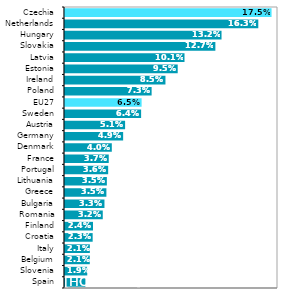
| Category | 2020 |
|---|---|
| Spain | 0.017 |
| Slovenia | 0.019 |
| Belgium | 0.021 |
| Italy | 0.021 |
| Croatia | 0.023 |
| Finland | 0.024 |
| Romania | 0.032 |
| Bulgaria | 0.033 |
| Greece | 0.035 |
| Lithuania | 0.035 |
| Portugal | 0.036 |
| France | 0.037 |
| Denmark | 0.04 |
| Germany | 0.049 |
| Austria | 0.051 |
| Sweden | 0.064 |
| EU27 | 0.065 |
| Poland | 0.073 |
| Ireland | 0.085 |
| Estonia | 0.095 |
| Latvia | 0.101 |
| Slovakia | 0.127 |
| Hungary | 0.132 |
| Netherlands | 0.163 |
| Czechia | 0.175 |